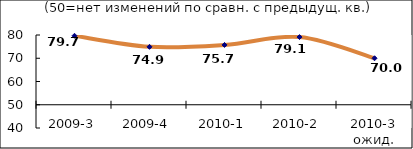
| Category | Диф.индекс ↓ |
|---|---|
| 2009-3 | 79.66 |
| 2009-4 | 74.905 |
| 2010-1 | 75.725 |
| 2010-2 | 79.11 |
| 2010-3 ожид. | 70 |